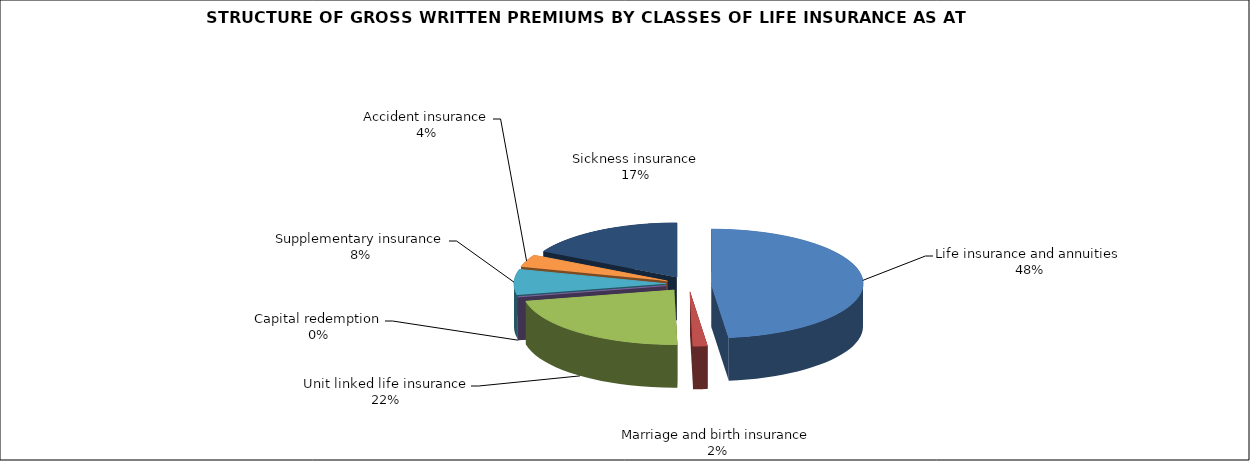
| Category | Life insurance and annuities |
|---|---|
| Life insurance and annuities | 0.482 |
| Marriage and birth insurance | 0.015 |
| Unit linked life insurance | 0.22 |
| Capital redemption | 0 |
| Supplementary insurance | 0.076 |
| Accident insurance | 0.037 |
| Sickness insurance | 0.171 |